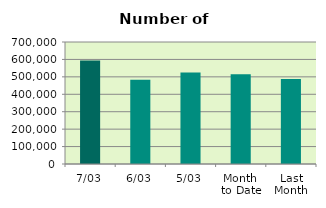
| Category | Series 0 |
|---|---|
| 7/03 | 593664 |
| 6/03 | 482984 |
| 5/03 | 524538 |
| Month 
to Date | 515131.2 |
| Last
Month | 488116.6 |